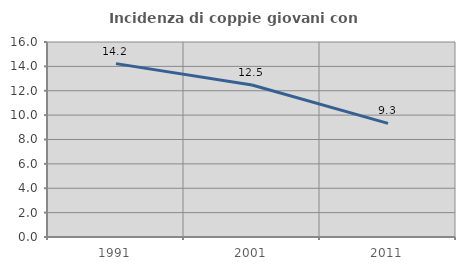
| Category | Incidenza di coppie giovani con figli |
|---|---|
| 1991.0 | 14.225 |
| 2001.0 | 12.475 |
| 2011.0 | 9.32 |